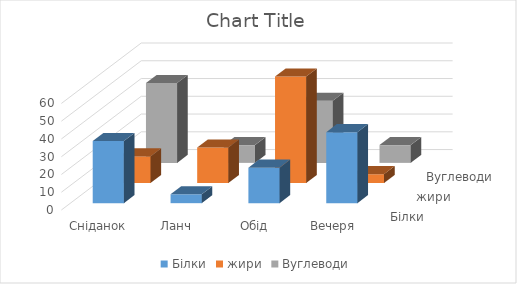
| Category | Білки | жири | Вуглеводи |
|---|---|---|---|
| Сніданок | 35 | 15 | 45 |
| Ланч | 5 | 20 | 10 |
| Обід | 20 | 60 | 35 |
| Вечеря | 40 | 5 | 10 |